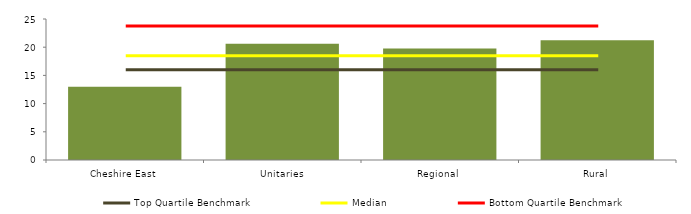
| Category | Block Data |
|---|---|
| Cheshire East | 13 |
| Unitaries | 20.613 |
| Regional | 19.75 |
|  Rural  | 21.217 |